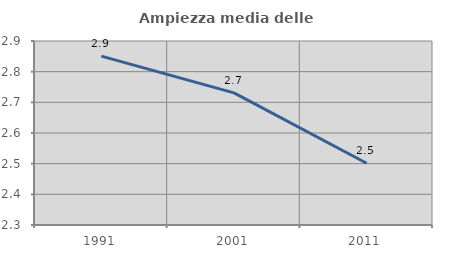
| Category | Ampiezza media delle famiglie |
|---|---|
| 1991.0 | 2.851 |
| 2001.0 | 2.731 |
| 2011.0 | 2.501 |